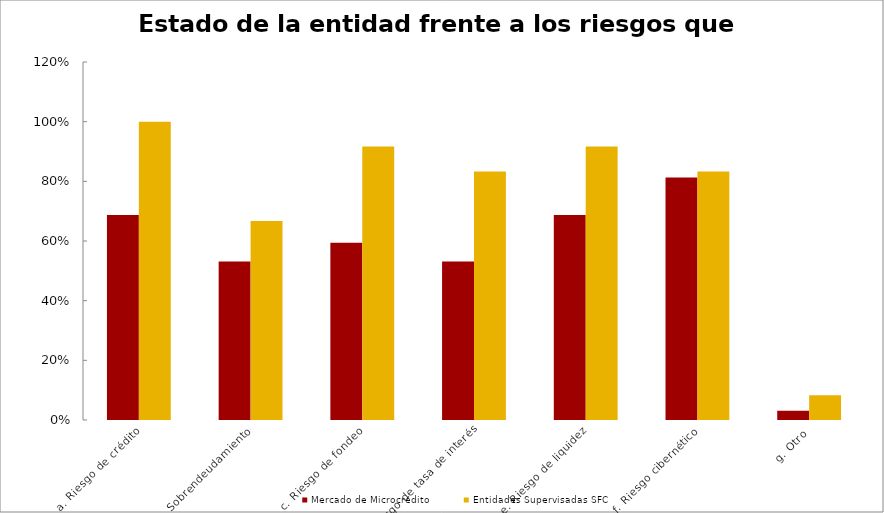
| Category | Mercado de Microcrédito | Entidades Supervisadas SFC |
|---|---|---|
| a. Riesgo de crédito | 0.688 | 1 |
| b. Sobrendeudamiento | 0.531 | 0.667 |
| c. Riesgo de fondeo | 0.594 | 0.917 |
| d. Riesgo de tasa de interés | 0.531 | 0.833 |
| e. Riesgo de liquidez | 0.688 | 0.917 |
| f. Riesgo cibernético | 0.812 | 0.833 |
| g. Otro | 0.031 | 0.083 |